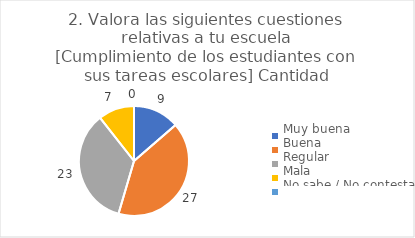
| Category | 2. Valora las siguientes cuestiones relativas a tu escuela
[Cumplimiento de los estudiantes con sus tareas escolares] |
|---|---|
| Muy buena  | 0.136 |
| Buena  | 0.409 |
| Regular  | 0.348 |
| Mala  | 0.106 |
| No sabe / No contesta | 0 |